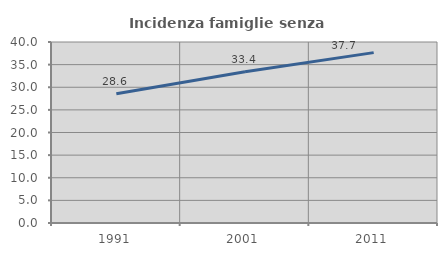
| Category | Incidenza famiglie senza nuclei |
|---|---|
| 1991.0 | 28.567 |
| 2001.0 | 33.43 |
| 2011.0 | 37.65 |